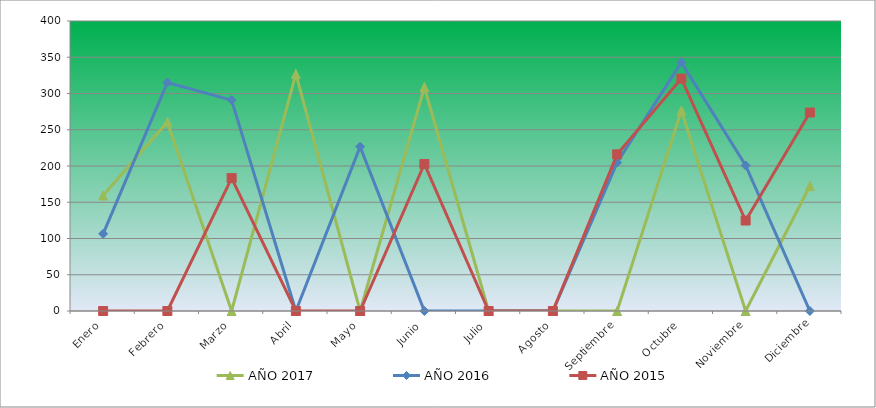
| Category | AÑO 2017 | AÑO 2016 | AÑO 2015 |
|---|---|---|---|
| Enero | 159.281 | 106.439 | 0 |
| Febrero | 260.791 | 315.254 | 0 |
| Marzo | 0 | 290.878 | 183.305 |
| Abril | 326.814 | 0 | 0 |
| Mayo | 0 | 226.69 | 0 |
| Junio | 308.658 | 0 | 202.806 |
| Julio | 0 | 0 | 0 |
| Agosto | 0 | 0 | 0 |
| Septiembre | 0 | 204.752 | 216.066 |
| Octubre | 276.472 | 342.879 | 320.589 |
| Noviembre | 0 | 200.69 | 124.803 |
| Diciembre | 172.485 | 0 | 273.788 |